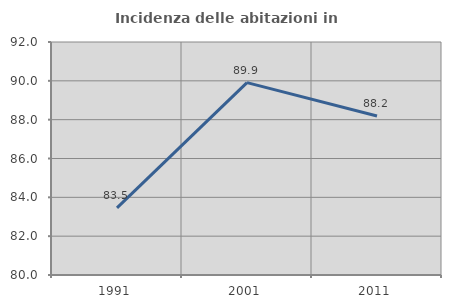
| Category | Incidenza delle abitazioni in proprietà  |
|---|---|
| 1991.0 | 83.46 |
| 2001.0 | 89.906 |
| 2011.0 | 88.19 |